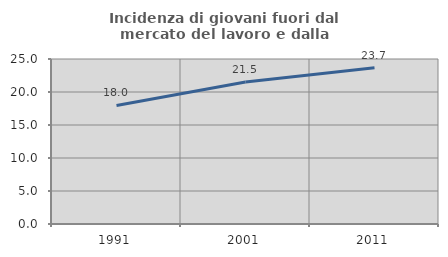
| Category | Incidenza di giovani fuori dal mercato del lavoro e dalla formazione  |
|---|---|
| 1991.0 | 17.96 |
| 2001.0 | 21.526 |
| 2011.0 | 23.661 |